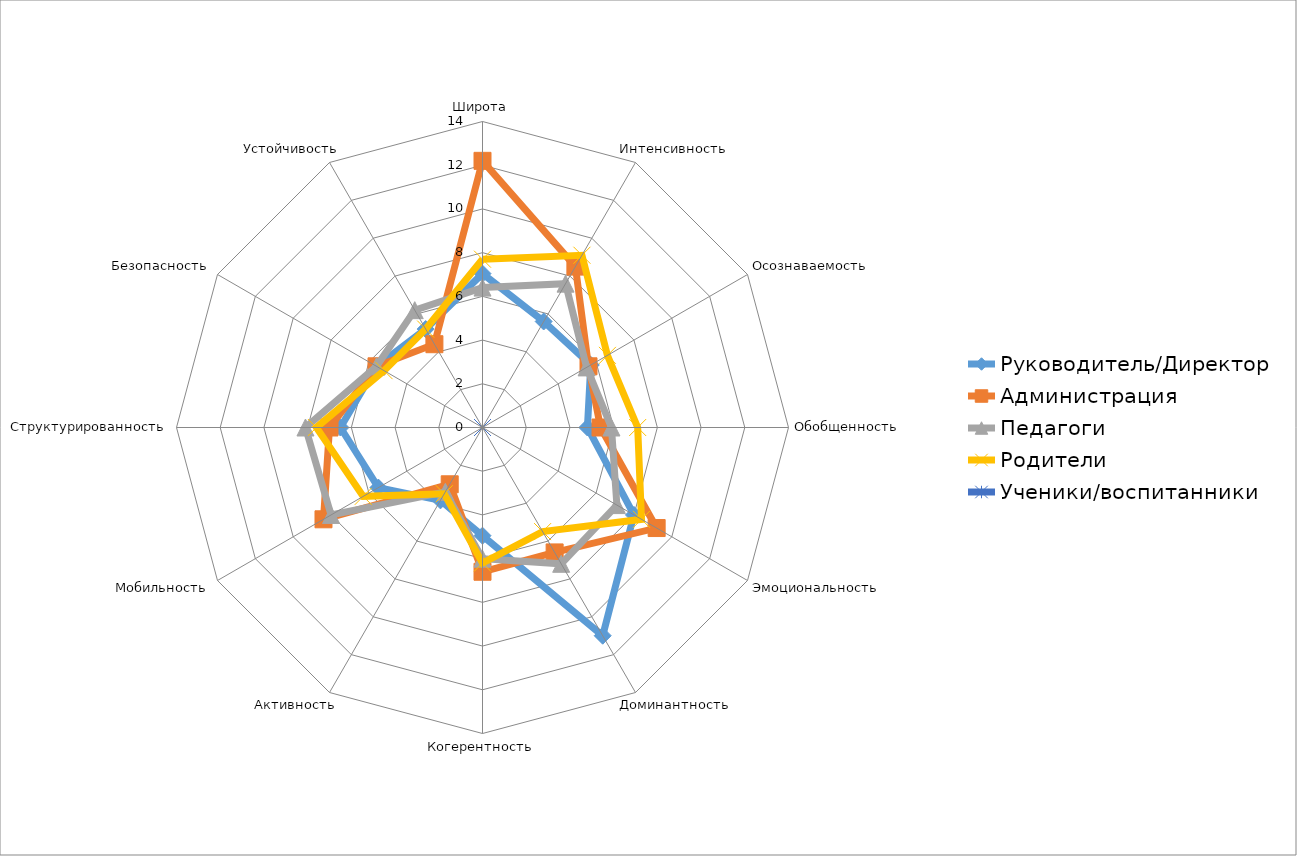
| Category | Руководитель/Директор | Администрация | Педагоги | Родители | Ученики/воспитанники |
|---|---|---|---|---|---|
| Широта | 7.04 | 12.2 | 6.4 | 7.7 | 0 |
| Интенсивность | 5.6 | 8.5 | 7.6 | 9.1 | 0 |
| Осознаваемость | 5.72 | 5.6 | 5.5 | 6.6 | 0 |
| Обобщенность | 4.8 | 5.4 | 5.9 | 7.1 | 0 |
| Эмоциональность | 8 | 9.2 | 7.1 | 8.4 | 0 |
| Доминантность | 11 | 6.6 | 7.2 | 5.5 | 0 |
| Когерентность | 4.95 | 6.6 | 6 | 6.2 | 0 |
| Активность | 3.85 | 3 | 3.4 | 3.5 | 0 |
| Мобильность | 5.5 | 8.4 | 8 | 6.3 | 0 |
| Структурированность | 6.5 | 7 | 8.1 | 7.6 | 0 |
| Безопасность | 5.6 | 5.6 | 5.6 | 5.2 | 0 |
| Устойчивость | 5.2 | 4.4 | 6.2 | 5.2 | 0 |